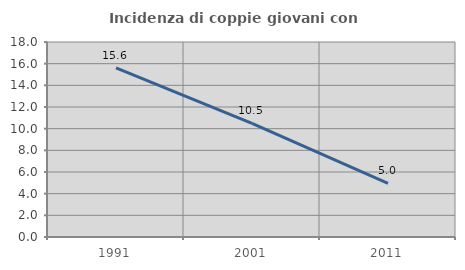
| Category | Incidenza di coppie giovani con figli |
|---|---|
| 1991.0 | 15.605 |
| 2001.0 | 10.482 |
| 2011.0 | 4.959 |